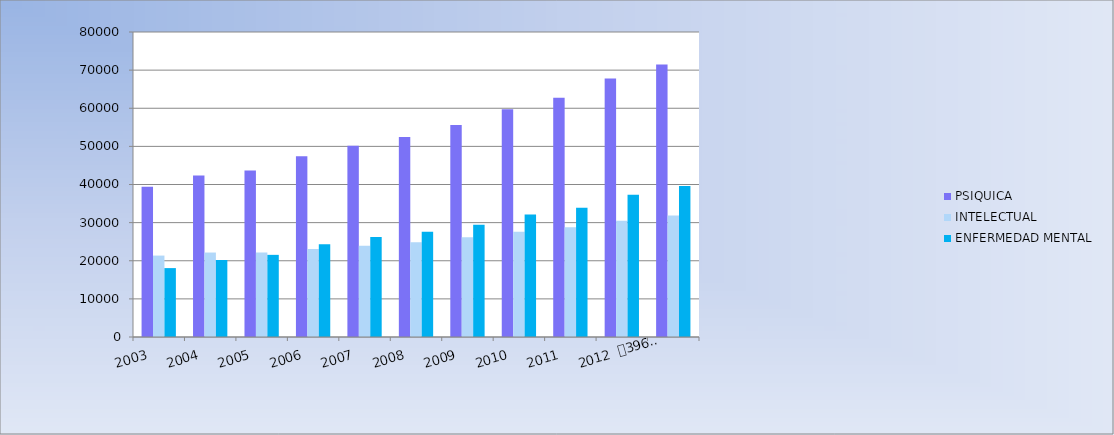
| Category | PSIQUICA | INTELECTUAL | ENFERMEDAD MENTAL |
|---|---|---|---|
| 0 | 39428 | 21356 | 18072 |
| 1 | 42356 | 22155 | 20201 |
| 2 | 43704 | 22157 | 21547 |
| 3 | 47420 | 23069 | 24351 |
| 4 | 50187 | 23955 | 26232 |
| 5 | 52452 | 24835 | 27617 |
| 6 | 55620 | 26194 | 29426 |
| 7 | 59721 | 27588 | 32133 |
| 8 | 62730 | 28801 | 33929 |
| 9 | 67835 | 30495 | 37340 |
| 10 | 71501 | 31889 | 39612 |